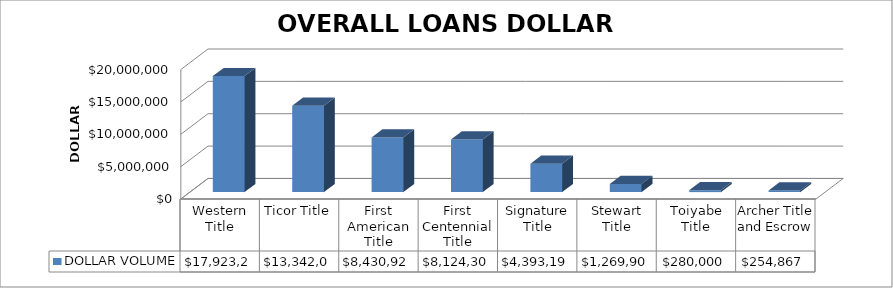
| Category | DOLLAR VOLUME |
|---|---|
| Western Title | 17923273 |
| Ticor Title | 13342083 |
| First American Title | 8430921 |
| First Centennial Title | 8124303 |
| Signature Title | 4393193 |
| Stewart Title | 1269900 |
| Toiyabe Title | 280000 |
| Archer Title and Escrow | 254867 |